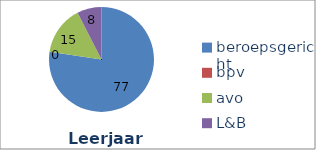
| Category | Series 1 | Series 0 |
|---|---|---|
| beroepsgericht | 77.371 | 77.371 |
| bpv | 0 | 0 |
| avo | 15.086 | 15.086 |
| L&B | 7.543 | 7.543 |